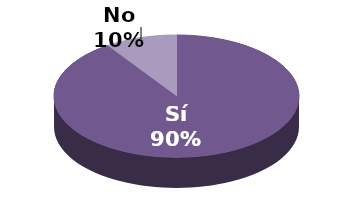
| Category | Series 1 |
|---|---|
| Sí | 19 |
| No | 2 |